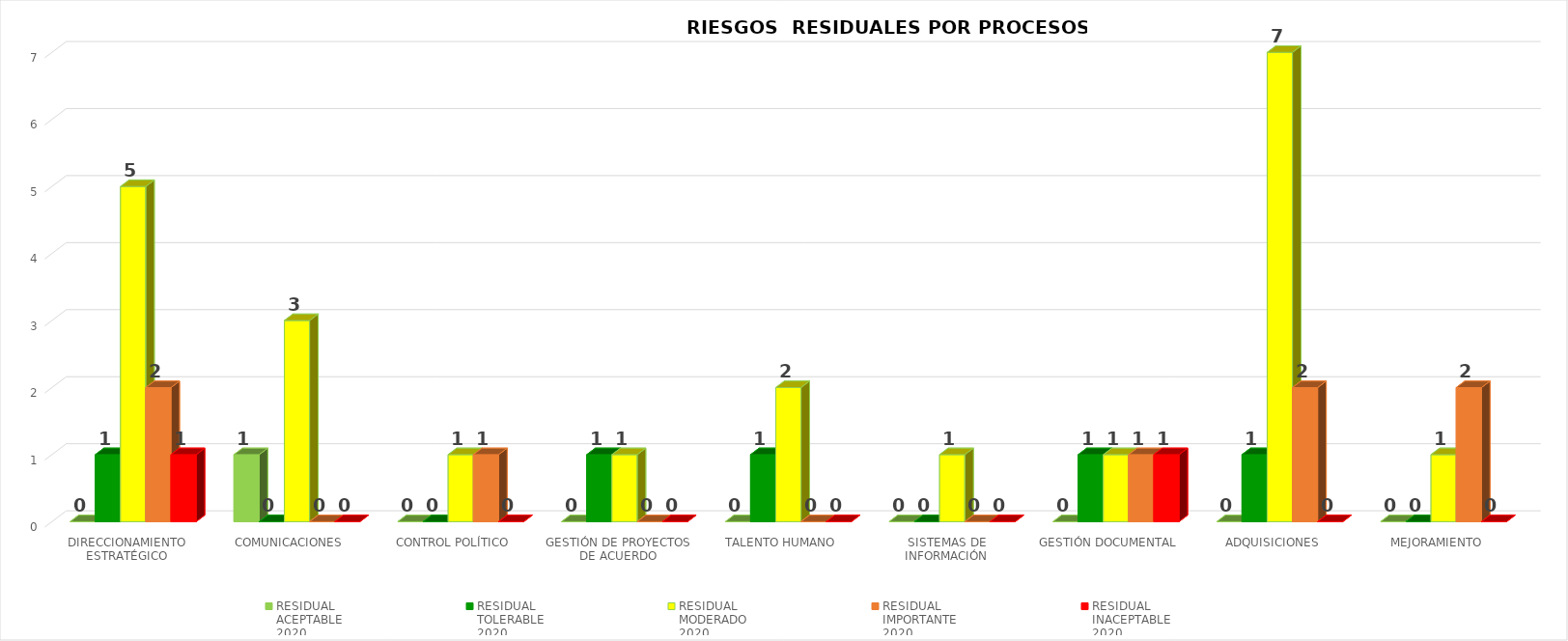
| Category | RESIDUAL
ACEPTABLE
2020 | RESIDUAL
TOLERABLE
2020 | RESIDUAL
MODERADO
2020 | RESIDUAL
IMPORTANTE
2020 | RESIDUAL
INACEPTABLE
2020 |
|---|---|---|---|---|---|
| DIRECCIONAMIENTO ESTRATÉGICO | 0 | 1 | 5 | 2 | 1 |
| COMUNICACIONES | 1 | 0 | 3 | 0 | 0 |
| CONTROL POLÍTICO | 0 | 0 | 1 | 1 | 0 |
| GESTIÓN DE PROYECTOS DE ACUERDO | 0 | 1 | 1 | 0 | 0 |
| TALENTO HUMANO | 0 | 1 | 2 | 0 | 0 |
| SISTEMAS DE INFORMACIÓN | 0 | 0 | 1 | 0 | 0 |
| GESTIÓN DOCUMENTAL | 0 | 1 | 1 | 1 | 1 |
| ADQUISICIONES | 0 | 1 | 7 | 2 | 0 |
| MEJORAMIENTO | 0 | 0 | 1 | 2 | 0 |